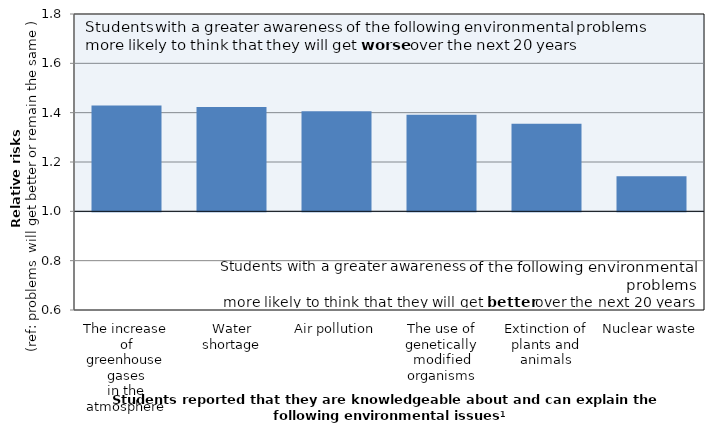
| Category | Relative risk |
|---|---|
| The increase of
greenhouse gases
in the atmosphere | 1.429 |
| Water shortage | 1.423 |
| Air pollution | 1.406 |
| The use of genetically modified organisms | 1.392 |
| Extinction of plants and animals | 1.355 |
| Nuclear waste | 1.142 |